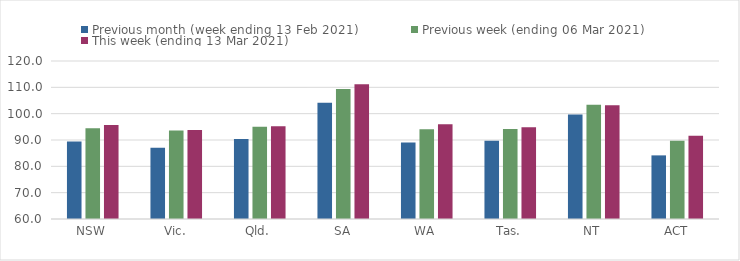
| Category | Previous month (week ending 13 Feb 2021) | Previous week (ending 06 Mar 2021) | This week (ending 13 Mar 2021) |
|---|---|---|---|
| NSW | 89.42 | 94.46 | 95.66 |
| Vic. | 87.01 | 93.63 | 93.8 |
| Qld. | 90.38 | 95.04 | 95.25 |
| SA | 104.1 | 109.35 | 111.14 |
| WA | 89.01 | 94.04 | 95.94 |
| Tas. | 89.76 | 94.16 | 94.82 |
| NT | 99.66 | 103.36 | 103.19 |
| ACT | 84.16 | 89.67 | 91.62 |